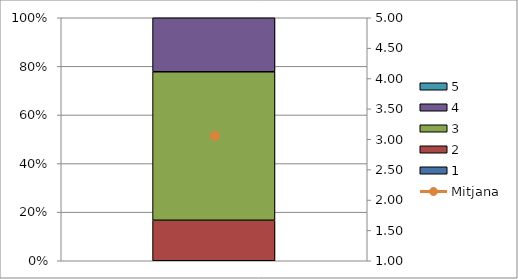
| Category | 1 | 2 | 3 | 4 | 5 |
|---|---|---|---|---|---|
| 0 | 0 | 6 | 22 | 8 | 0 |